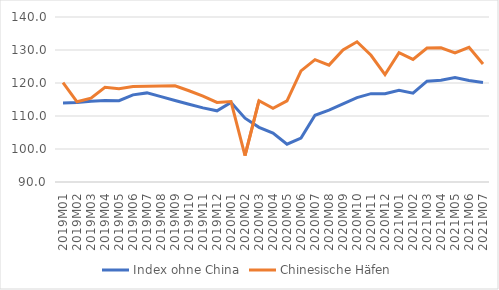
| Category | Index ohne China | Chinesische Häfen |
|---|---|---|
| 2019M01 | 113.943 | 120.12 |
| 2019M02 | 114.082 | 114.307 |
| 2019M03 | 114.491 | 115.408 |
| 2019M04 | 114.668 | 118.687 |
| 2019M05 | 114.647 | 118.292 |
| 2019M06 | 116.399 | 118.952 |
| 2019M07 | 117 | 119.045 |
| 2019M08 | 115.865 | 119.087 |
| 2019M09 | 114.699 | 119.165 |
| 2019M10 | 113.576 | 117.651 |
| 2019M11 | 112.451 | 116.013 |
| 2019M12 | 111.563 | 114.104 |
| 2020M01 | 114.131 | 114.383 |
| 2020M02 | 109.333 | 97.988 |
| 2020M03 | 106.561 | 114.636 |
| 2020M04 | 104.836 | 112.338 |
| 2020M05 | 101.459 | 114.599 |
| 2020M06 | 103.323 | 123.67 |
| 2020M07 | 110.233 | 127.072 |
| 2020M08 | 111.748 | 125.419 |
| 2020M09 | 113.704 | 130.024 |
| 2020M10 | 115.583 | 132.498 |
| 2020M11 | 116.766 | 128.396 |
| 2020M12 | 116.745 | 122.524 |
| 2021M01 | 117.774 | 129.186 |
| 2021M02 | 116.91 | 127.161 |
| 2021M03 | 120.549 | 130.574 |
| 2021M04 | 120.861 | 130.688 |
| 2021M05 | 121.643 | 129.151 |
| 2021M06 | 120.748 | 130.825 |
| 2021M07 | 120.183 | 125.74 |